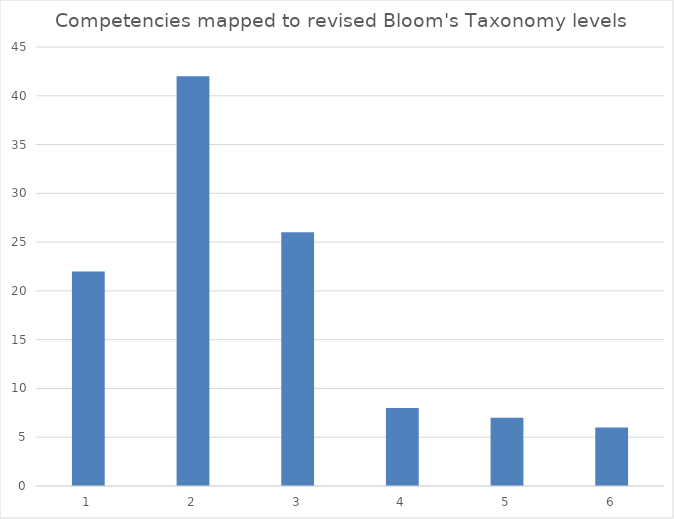
| Category | Series 0 |
|---|---|
| 0 | 22 |
| 1 | 42 |
| 2 | 26 |
| 3 | 8 |
| 4 | 7 |
| 5 | 6 |